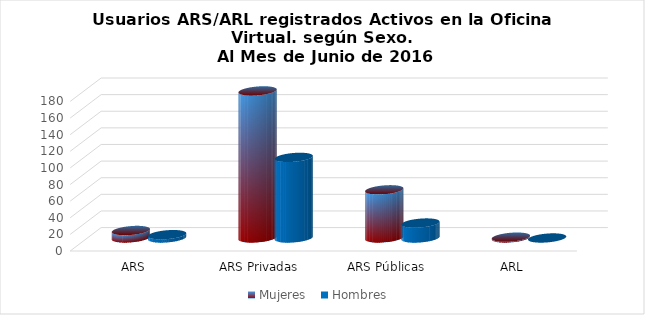
| Category | Mujeres | Hombres |
|---|---|---|
| ARS Autogestionadas | 9 | 4 |
| ARS Privadas | 177 | 97 |
| ARS Públicas | 58 | 18 |
| ARL | 1 | 0 |